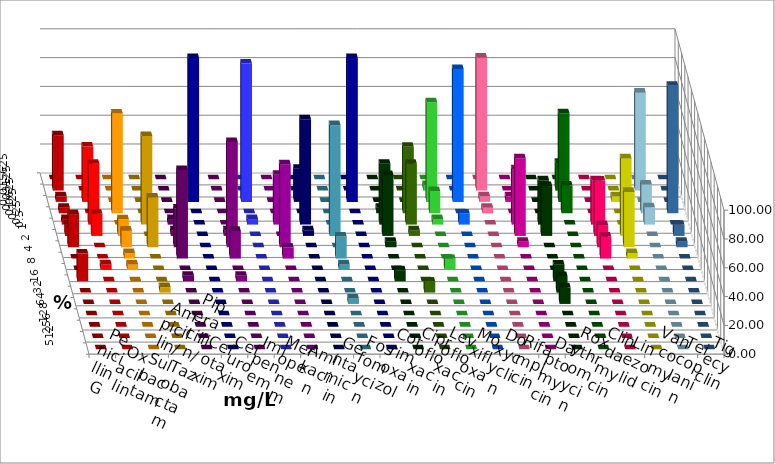
| Category | Penicillin G | Oxacillin | Ampicillin/ Sulbactam | Piperacillin/ Tazobactam | Cefotaxim | Cefuroxim | Imipenem | Meropenem | Amikacin | Gentamicin | Fosfomycin | Cotrimoxazol | Ciprofloxacin | Levofloxacin | Moxifloxacin | Doxycyclin | Rifampicin | Daptomycin | Roxythromycin | Clindamycin | Linezolid | Vancomycin | Teicoplanin | Tigecyclin |
|---|---|---|---|---|---|---|---|---|---|---|---|---|---|---|---|---|---|---|---|---|---|---|---|---|
| 0.015625 | 0 | 0 | 0 | 0 | 0 | 0 | 0 | 0 | 0 | 0 | 0 | 0 | 0 | 0 | 0 | 0 | 0 | 0 | 0 | 0 | 0 | 0 | 0 | 0 |
| 0.03125 | 38.462 | 0 | 0 | 0 | 0 | 0 | 0 | 0 | 0 | 0 | 0 | 0 | 0 | 0 | 3.846 | 0 | 92.308 | 0 | 0 | 19.231 | 0 | 0 | 0 | 68 |
| 0.0625 | 3.846 | 38.462 | 0 | 0 | 0 | 0 | 100 | 96.154 | 0 | 23.077 | 0 | 100 | 0 | 0 | 69.231 | 92.308 | 3.846 | 3.846 | 0 | 61.538 | 0 | 3.846 | 0 | 0 |
| 0.125 | 3.846 | 0 | 69.231 | 0 | 0 | 0 | 0 | 0 | 0 | 0 | 0 | 0 | 3.846 | 46.154 | 15.385 | 0 | 3.846 | 0 | 0 | 19.231 | 0 | 0 | 88.462 | 20 |
| 0.25 | 3.846 | 42.308 | 0 | 61.538 | 3.846 | 0 | 0 | 3.846 | 34.615 | 73.077 | 0 | 0 | 42.308 | 42.308 | 3.846 | 7.692 | 0 | 38.462 | 30.769 | 0 | 30.769 | 0 | 0 | 12 |
| 0.5 | 7.692 | 15.385 | 11.538 | 0 | 3.846 | 3.846 | 0 | 0 | 0 | 3.846 | 76.923 | 0 | 42.308 | 3.846 | 0 | 0 | 0 | 53.846 | 34.615 | 0 | 38.462 | 53.846 | 7.692 | 0 |
| 1.0 | 23.077 | 0 | 11.538 | 34.615 | 26.923 | 73.077 | 0 | 0 | 57.692 | 0 | 0 | 0 | 3.846 | 0 | 0 | 0 | 0 | 3.846 | 0 | 0 | 15.385 | 38.462 | 3.846 | 0 |
| 2.0 | 0 | 0 | 3.846 | 0 | 61.538 | 19.231 | 0 | 0 | 7.692 | 0 | 15.385 | 0 | 0 | 0 | 0 | 0 | 0 | 0 | 0 | 0 | 15.385 | 3.846 | 0 | 0 |
| 4.0 | 0 | 3.846 | 3.846 | 0 | 0 | 0 | 0 | 0 | 0 | 0 | 3.846 | 0 | 0 | 0 | 7.692 | 0 | 0 | 0 | 0 | 0 | 0 | 0 | 0 | 0 |
| 8.0 | 19.231 | 0 | 0 | 0 | 3.846 | 3.846 | 0 | 0 | 0 | 0 | 0 | 0 | 7.692 | 0 | 0 | 0 | 0 | 0 | 11.538 | 0 | 0 | 0 | 0 | 0 |
| 16.0 | 0 | 0 | 0 | 3.846 | 0 | 0 | 0 | 0 | 0 | 0 | 0 | 0 | 0 | 7.692 | 0 | 0 | 0 | 0 | 11.538 | 0 | 0 | 0 | 0 | 0 |
| 32.0 | 0 | 0 | 0 | 0 | 0 | 0 | 0 | 0 | 0 | 0 | 3.846 | 0 | 0 | 0 | 0 | 0 | 0 | 0 | 11.538 | 0 | 0 | 0 | 0 | 0 |
| 64.0 | 0 | 0 | 0 | 0 | 0 | 0 | 0 | 0 | 0 | 0 | 0 | 0 | 0 | 0 | 0 | 0 | 0 | 0 | 0 | 0 | 0 | 0 | 0 | 0 |
| 128.0 | 0 | 0 | 0 | 0 | 0 | 0 | 0 | 0 | 0 | 0 | 0 | 0 | 0 | 0 | 0 | 0 | 0 | 0 | 0 | 0 | 0 | 0 | 0 | 0 |
| 256.0 | 0 | 0 | 0 | 0 | 0 | 0 | 0 | 0 | 0 | 0 | 0 | 0 | 0 | 0 | 0 | 0 | 0 | 0 | 0 | 0 | 0 | 0 | 0 | 0 |
| 512.0 | 0 | 0 | 0 | 0 | 0 | 0 | 0 | 0 | 0 | 0 | 0 | 0 | 0 | 0 | 0 | 0 | 0 | 0 | 0 | 0 | 0 | 0 | 0 | 0 |